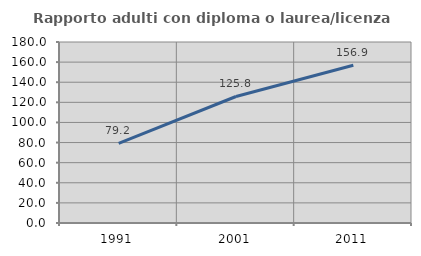
| Category | Rapporto adulti con diploma o laurea/licenza media  |
|---|---|
| 1991.0 | 79.167 |
| 2001.0 | 125.806 |
| 2011.0 | 156.886 |